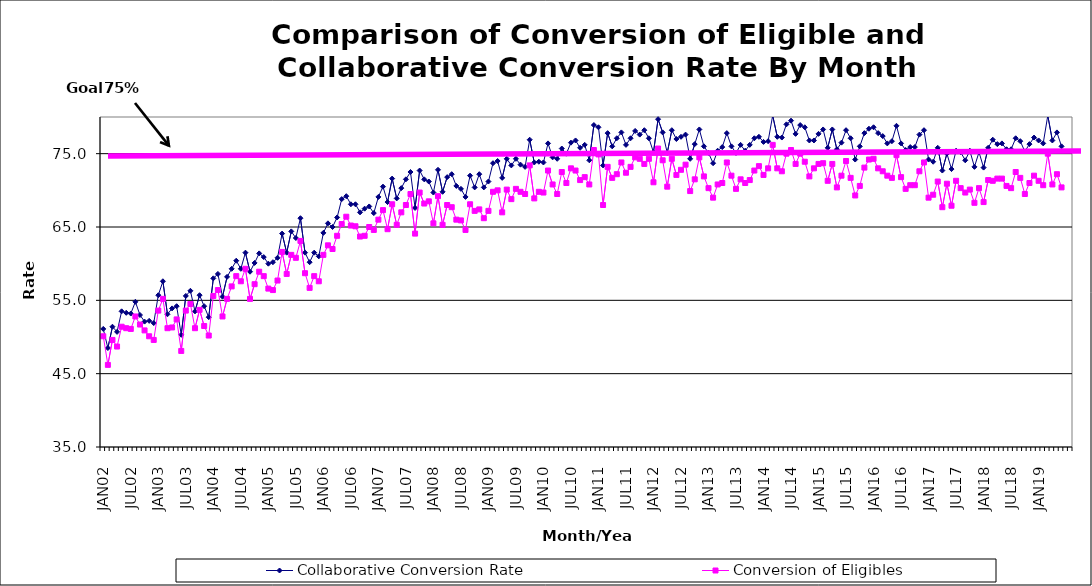
| Category | Collaborative Conversion Rate | Conversion of Eligibles |
|---|---|---|
| JAN02 | 51.1 | 50.1 |
| FEB02 | 48.5 | 46.2 |
| MAR02 | 51.4 | 49.6 |
| APR02 | 50.7 | 48.7 |
| MAY02 | 53.5 | 51.4 |
| JUN02 | 53.3 | 51.2 |
| JUL02 | 53.2 | 51.1 |
| AUG02 | 54.8 | 52.8 |
| SEP02 | 53 | 51.7 |
| OCT02 | 52.1 | 50.9 |
| NOV02 | 52.2 | 50.1 |
| DEC02 | 51.9 | 49.6 |
| JAN03 | 55.7 | 53.6 |
| FEB03 | 57.6 | 55.2 |
| MAR03 | 53.1 | 51.2 |
| APR03 | 53.9 | 51.3 |
| MAY03 | 54.2 | 52.4 |
| JUN03 | 50.3 | 48.1 |
| JUL03 | 55.6 | 53.6 |
| AUG03 | 56.3 | 54.5 |
| SEP03 | 53.5 | 51.2 |
| OCT03 | 55.7 | 53.7 |
| NOV03 | 54.2 | 51.5 |
| DEC03 | 52.7 | 50.2 |
| JAN04 | 58 | 55.6 |
| FEB04 | 58.6 | 56.4 |
| MAR04 | 55.5 | 52.8 |
| APR04 | 58.2 | 55.2 |
| MAY04 | 59.3 | 56.9 |
| JUN04 | 60.4 | 58.3 |
| JUL04 | 59.3 | 57.6 |
| AUG04 | 61.5 | 59.3 |
| SEP04 | 58.9 | 55.2 |
| OCT04 | 60.1 | 57.2 |
| NOV04 | 61.4 | 58.9 |
| DEC04 | 60.9 | 58.3 |
| JAN05 | 60 | 56.6 |
| FEB05 | 60.2 | 56.4 |
| MAR05 | 60.8 | 57.7 |
| APR05 | 64.1 | 61.6 |
| MAY05 | 61.5 | 58.6 |
| JUN05 | 64.4 | 61.2 |
| JUL05 | 63.5 | 60.8 |
| AUG05 | 66.2 | 63.1 |
| SEP05 | 61.5 | 58.7 |
| OCT05 | 60.2 | 56.7 |
| NOV05 | 61.5 | 58.3 |
| DEC05 | 61 | 57.6 |
| JAN06 | 64.2 | 61.2 |
| FEB06 | 65.5 | 62.5 |
| MAR06 | 65 | 62 |
| APR06 | 66.3 | 63.8 |
| MAY06 | 68.8 | 65.4 |
| JUN06 | 69.2 | 66.4 |
| JUL06 | 68.1 | 65.2 |
| AUG06 | 68.1 | 65.1 |
| SEP06 | 67 | 63.7 |
| OCT06 | 67.5 | 63.8 |
| NOV06 | 67.8 | 65 |
| DEC06 | 66.9 | 64.6 |
| JAN07 | 69.1 | 66 |
| FEB07 | 70.5 | 67.3 |
| MAR07 | 68.4 | 64.7 |
| APR07 | 71.6 | 68.1 |
| MAY07 | 68.9 | 65.3 |
| JUN07 | 70.3 | 67 |
| JUL07 | 71.5 | 68 |
| AUG07 | 72.5 | 69.5 |
| SEP07 | 67.6 | 64.1 |
| OCT07 | 72.7 | 69.7 |
| NOV07 | 71.5 | 68.2 |
| DEC07 | 71.2 | 68.5 |
| JAN08 | 69.7 | 65.5 |
| FEB08 | 72.8 | 69.2 |
| MAR08 | 69.8 | 65.3 |
| APR08 | 71.8 | 68 |
| MAY08 | 72.2 | 67.7 |
| JUN08 | 70.6 | 66 |
| JUL08 | 70.2 | 65.9 |
| AUG08 | 69.1 | 64.6 |
| SEP08 | 72 | 68.1 |
| OCT08 | 70.4 | 67.2 |
| NOV08 | 72.2 | 67.4 |
| DEC08 | 70.4 | 66.2 |
| JAN09 | 71.2 | 67.2 |
| FEB09 | 73.7 | 69.8 |
| MAR09 | 74 | 70 |
| APR09 | 71.7 | 67 |
| MAY09 | 74.3 | 70.1 |
| JUN09 | 73.4 | 68.8 |
| JUL09 | 74.3 | 70.2 |
| AUG09 | 73.5 | 69.8 |
| SEP09 | 73.2 | 69.5 |
| OCT09 | 76.9 | 73.4 |
| NOV09 | 73.8 | 68.9 |
| DEC09 | 73.9 | 69.8 |
| JAN10 | 73.8 | 69.7 |
| FEB10 | 76.4 | 72.7 |
| MAR10 | 74.5 | 70.8 |
| APR10 | 74.3 | 69.5 |
| MAY10 | 75.7 | 72.5 |
| JUN10 | 75 | 71 |
| JUL10 | 76.5 | 73 |
| AUG10 | 76.8 | 72.7 |
| SEP10 | 75.8 | 71.4 |
| OCT10 | 76.2 | 71.8 |
| NOV10 | 74.1 | 70.8 |
| DEC10 | 78.9 | 75.5 |
| JAN11 | 78.6 | 74.9 |
| FEB11 | 73.4 | 68 |
| MAR11 | 77.8 | 73.2 |
| APR11 | 76 | 71.7 |
| MAY11 | 77.1 | 72.2 |
| JUN11 | 77.9 | 73.8 |
| JUL11 | 76.2 | 72.4 |
| AUG11 | 77.1 | 73.2 |
| SEP11 | 78.1 | 74.5 |
| OCT11 | 77.6 | 74.3 |
| NOV11 | 78.2 | 73.6 |
| DEC11 | 77.1 | 74.3 |
| JAN12 | 75.2 | 71.1 |
| FEB12 | 79.7 | 75.7 |
| MAR12 | 77.9 | 74.1 |
| APR12 | 75.1 | 70.5 |
| MAY12 | 78.2 | 74.3 |
| JUN12 | 77 | 72.1 |
| JUL12 | 77.3 | 72.8 |
| AUG12 | 77.6 | 73.5 |
| SEP12 | 74.3 | 69.9 |
| OCT12 | 76.3 | 71.5 |
| NOV12 | 78.3 | 74.5 |
| DEC12 | 76 | 71.9 |
| JAN13 | 75.1 | 70.3 |
| FEB13 | 73.7 | 69 |
| MAR13 | 75.4 | 70.8 |
| APR13 | 75.9 | 71 |
| MAY13 | 77.8 | 73.8 |
| JUN13 | 76 | 72 |
| JUL13 | 75.1 | 70.2 |
| AUG13 | 76.2 | 71.5 |
| SEP13 | 75.4 | 71 |
| OCT13 | 76.2 | 71.4 |
| NOV13 | 77.1 | 72.7 |
| DEC13 | 77.3 | 73.3 |
| JAN14 | 76.6 | 72.1 |
| FEB14 | 76.7 | 73 |
| MAR14 | 80.2 | 76.2 |
| APR14 | 77.3 | 73 |
| MAY14 | 77.2 | 72.6 |
| JUN14 | 79 | 75 |
| JUL14 | 79.5 | 75.5 |
| AUG14 | 77.7 | 73.6 |
| SEP14 | 78.9 | 75 |
| OCT14 | 78.6 | 73.9 |
| NOV14 | 76.8 | 71.9 |
| DEC14 | 76.8 | 73 |
| JAN15 | 77.7 | 73.6 |
| FEB15 | 78.3 | 73.7 |
| MAR15 | 75.8 | 71.3 |
| APR15 | 78.3 | 73.6 |
| MAY15 | 75.6 | 70.4 |
| JUN15 | 76.5 | 72 |
| JUL15 | 78.2 | 74 |
| AUG15 | 77.1 | 71.7 |
| SEP15 | 74.2 | 69.3 |
| OCT15 | 76 | 70.6 |
| NOV15 | 77.8 | 73.1 |
| DEC15 | 78.4 | 74.2 |
| JAN16 | 78.6 | 74.3 |
| FEB16 | 77.8 | 73 |
| MAR16 | 77.4 | 72.6 |
| APR16 | 76.4 | 72 |
| MAY16 | 76.7 | 71.7 |
| JUN16 | 78.8 | 74.8 |
| JUL16 | 76.4 | 71.8 |
| AUG16 | 75.5 | 70.2 |
| SEP16 | 75.9 | 70.7 |
| OCT16 | 75.9 | 70.7 |
| NOV16 | 77.6 | 72.6 |
| DEC16 | 78.2 | 73.8 |
| JAN17 | 74.2 | 69 |
| FEB17 | 73.9 | 69.4 |
| MAR17 | 75.8 | 71.2 |
| APR17 | 72.7 | 67.7 |
| MAY17 | 75 | 70.9 |
| JUN17 | 72.9 | 67.9 |
| JUL17 | 75.4 | 71.3 |
| AUG17 | 75.2 | 70.3 |
| SEP17 | 74.1 | 69.7 |
| OCT17 | 75.4 | 70.1 |
| NOV17 | 73.2 | 68.3 |
| DEC17 | 75.2 | 70.3 |
| JAN18 | 73.1 | 68.4 |
| FEB18 | 75.8 | 71.4 |
| MAR18 | 76.9 | 71.3 |
| APR18 | 76.3 | 71.6 |
| MAY18 | 76.4 | 71.6 |
| JUN18 | 75.6 | 70.6 |
| JUL18 | 75.6 | 70.3 |
| AUG18 | 77.1 | 72.5 |
| SEP18 | 76.7 | 71.7 |
| OCT18 | 75.3 | 69.5 |
| NOV18 | 76.3 | 71 |
| DEC18 | 77.2 | 72 |
| JAN19 | 76.8 | 71.3 |
| FEB19 | 76.4 | 70.7 |
| MAR19 | 80.2 | 75 |
| APR19 | 76.8 | 70.8 |
| MAY19 | 77.9 | 72.2 |
| JUN19 | 76 | 70.4 |